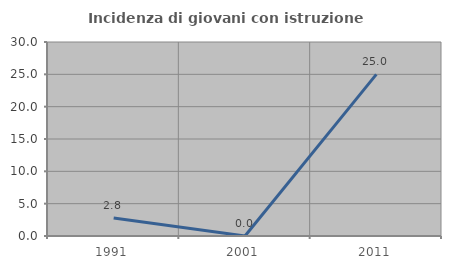
| Category | Incidenza di giovani con istruzione universitaria |
|---|---|
| 1991.0 | 2.778 |
| 2001.0 | 0 |
| 2011.0 | 25 |